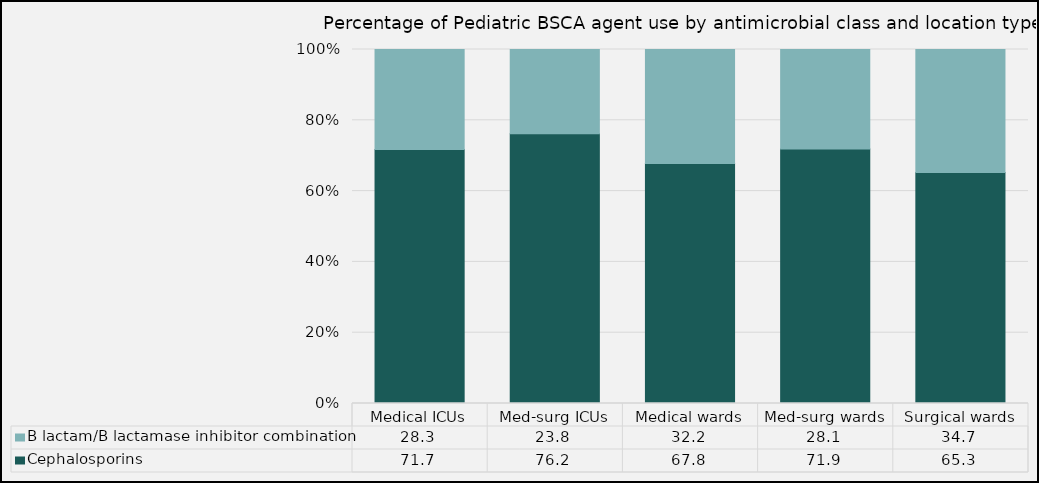
| Category | Cephalosporins | B lactam/B lactamase inhibitor combination |
|---|---|---|
| Medical ICUs | 71.7 | 28.25 |
| Med-surg ICUs | 76.21 | 23.79 |
| Medical wards | 67.78 | 32.22 |
| Med-surg wards | 71.86 | 28.14 |
| Surgical wards | 65.26 | 34.74 |